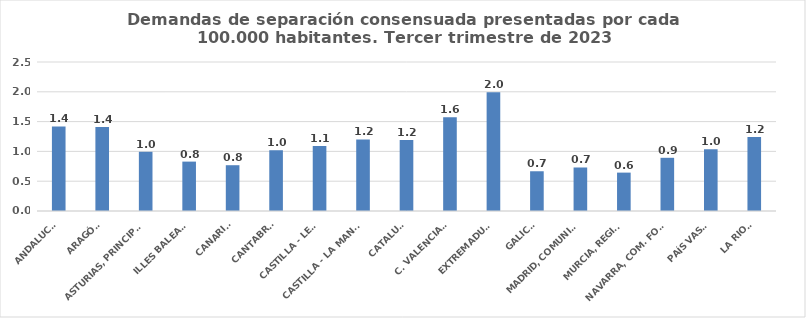
| Category | Series 0 |
|---|---|
| ANDALUCÍA | 1.418 |
| ARAGÓN | 1.408 |
| ASTURIAS, PRINCIPADO | 0.993 |
| ILLES BALEARS | 0.829 |
| CANARIAS | 0.768 |
| CANTABRIA | 1.019 |
| CASTILLA - LEÓN | 1.091 |
| CASTILLA - LA MANCHA | 1.202 |
| CATALUÑA | 1.19 |
| C. VALENCIANA | 1.571 |
| EXTREMADURA | 1.992 |
| GALICIA | 0.667 |
| MADRID, COMUNIDAD | 0.73 |
| MURCIA, REGIÓN | 0.644 |
| NAVARRA, COM. FORAL | 0.893 |
| PAÍS VASCO | 1.036 |
| LA RIOJA | 1.241 |